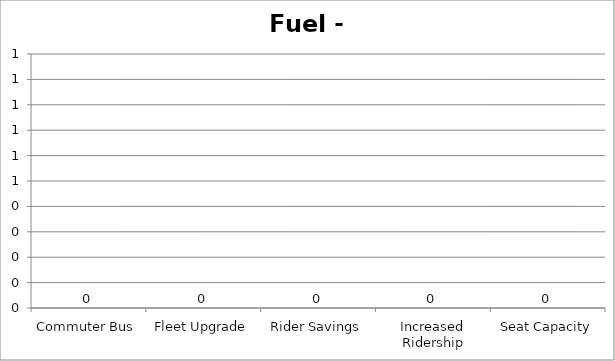
| Category | Fuel - GGE |
|---|---|
| Commuter Bus | 0 |
| Fleet Upgrade | 0 |
| Rider Savings | 0 |
| Increased Ridership | 0 |
| Seat Capacity | 0 |